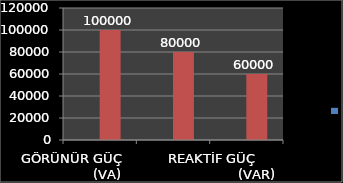
| Category | Series 0 | Series 1 |
|---|---|---|
| GÖRÜNÜR GÜÇ                  (VA) |  | 100000 |
| AKTİF GÜÇ                           (W) |  | 80000 |
| REAKTİF GÜÇ                       (VAR) |  | 60000 |